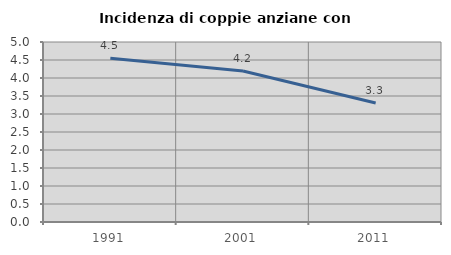
| Category | Incidenza di coppie anziane con figli |
|---|---|
| 1991.0 | 4.545 |
| 2001.0 | 4.196 |
| 2011.0 | 3.306 |